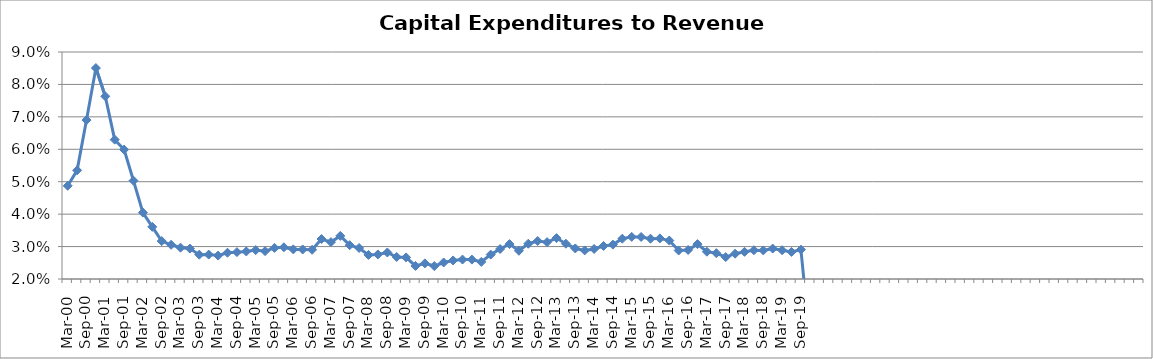
| Category | Series 0 |
|---|---|
| Mar-00 | 0.049 |
| Jun-00 | 0.054 |
| Sep-00 | 0.069 |
| Dec-00 | 0.085 |
| Mar-01 | 0.076 |
| Jun-01 | 0.063 |
| Sep-01 | 0.06 |
| Dec-01 | 0.05 |
| Mar-02 | 0.04 |
| Jun-02 | 0.036 |
| Sep-02 | 0.032 |
| Dec-02 | 0.031 |
| Mar-03 | 0.03 |
| Jun-03 | 0.029 |
| Sep-03 | 0.027 |
| Dec-03 | 0.028 |
| Mar-04 | 0.027 |
| Jun-04 | 0.028 |
| Sep-04 | 0.028 |
| Dec-04 | 0.028 |
| Mar-05 | 0.029 |
| Jun-05 | 0.029 |
| Sep-05 | 0.03 |
| Dec-05 | 0.03 |
| Mar-06 | 0.029 |
| Jun-06 | 0.029 |
| Sep-06 | 0.029 |
| Dec-06 | 0.032 |
| Mar-07 | 0.031 |
| Jun-07 | 0.033 |
| Sep-07 | 0.03 |
| Dec-07 | 0.03 |
| Mar-08 | 0.027 |
| Jun-08 | 0.028 |
| Sep-08 | 0.028 |
| Dec-08 | 0.027 |
| Mar-09 | 0.027 |
| Jun-09 | 0.024 |
| Sep-09 | 0.025 |
| Dec-09 | 0.024 |
| Mar-10 | 0.025 |
| Jun-10 | 0.026 |
| Sep-10 | 0.026 |
| Dec-10 | 0.026 |
| Mar-11 | 0.025 |
| Jun-11 | 0.028 |
| Sep-11 | 0.029 |
| Dec-11 | 0.031 |
| Mar-12 | 0.029 |
| Jun-12 | 0.031 |
| Sep-12 | 0.032 |
| Dec-12 | 0.031 |
| Mar-13 | 0.033 |
| Jun-13 | 0.031 |
| Sep-13 | 0.029 |
| Dec-13 | 0.029 |
| Mar-14 | 0.029 |
| Jun-14 | 0.03 |
| Sep-14 | 0.031 |
| Dec-14 | 0.032 |
| Mar-15 | 0.033 |
| Jun-15 | 0.033 |
| Sep-15 | 0.032 |
| Dec-15 | 0.033 |
| Mar-16 | 0.032 |
| Jun-16 | 0.029 |
| Sep-16 | 0.029 |
| Dec-16 | 0.031 |
| Mar-17 | 0.028 |
| Jun-17 | 0.028 |
| Sep-17 | 0.027 |
| Dec-17 | 0.028 |
| Mar-18 | 0.028 |
| Jun-18 | 0.029 |
| Sep-18 | 0.029 |
| Dec-18 | 0.029 |
| Mar-19 | 0.029 |
| Jun-19 | 0.028 |
| Sep-19 | 0.029 |